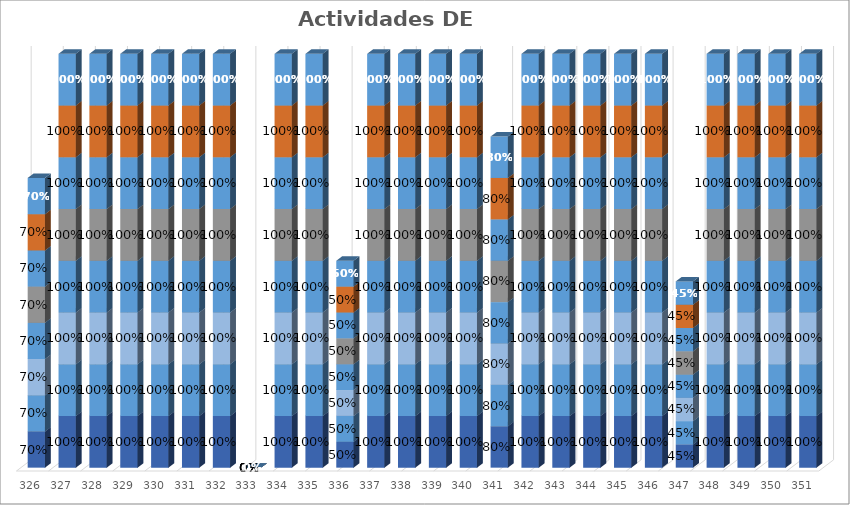
| Category | % Avance |
|---|---|
| 326.0 | 0.7 |
| 327.0 | 1 |
| 328.0 | 1 |
| 329.0 | 1 |
| 330.0 | 1 |
| 331.0 | 1 |
| 332.0 | 1 |
| 333.0 | 0 |
| 334.0 | 1 |
| 335.0 | 1 |
| 336.0 | 0.5 |
| 337.0 | 1 |
| 338.0 | 1 |
| 339.0 | 1 |
| 340.0 | 1 |
| 341.0 | 0.8 |
| 342.0 | 1 |
| 343.0 | 1 |
| 344.0 | 1 |
| 345.0 | 1 |
| 346.0 | 1 |
| 347.0 | 0.45 |
| 348.0 | 1 |
| 349.0 | 1 |
| 350.0 | 1 |
| 351.0 | 1 |